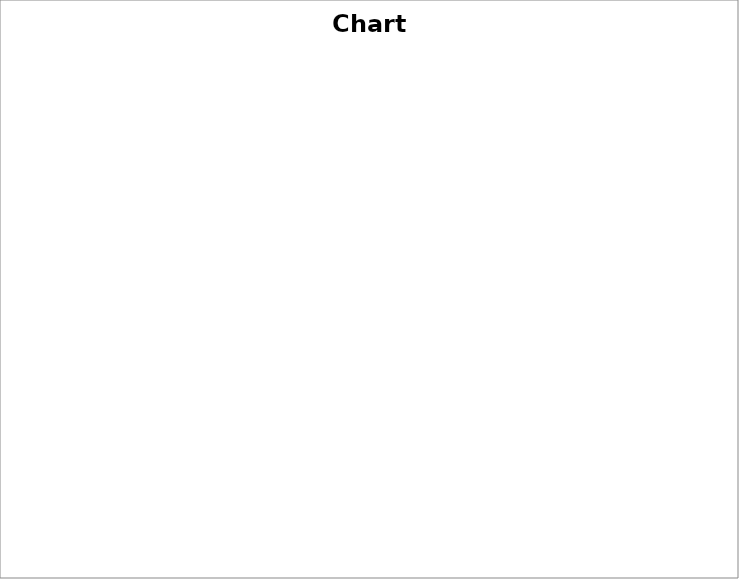
| Category | Series 0 |
|---|---|
| Main floor sq. ft. area or (bung level) | 0 |
| Second floor Sq. ft. area | 0 |
| Attic Truss area rough in only sq. ft. | 0 |
| Plus Attic Truss area finished sq. ft. | 0 |
| Walk-out basement | 0 |
| Developed basement sq. ft.  No bath | 0 |
| Add basement bathroom | 0 |
| Garage area (detached/out building) | 0 |
| Garage area (attached to home) | 0 |
| Deck areas no roof over # sq. ft. | 0 |
| Deck areas roof over sq. ft. | 0 |
| Acreage development (from sheet 2) | 0 |